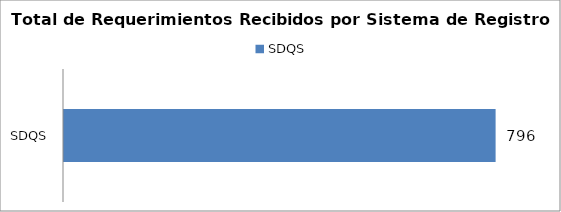
| Category | Total |
|---|---|
| SDQS | 796 |